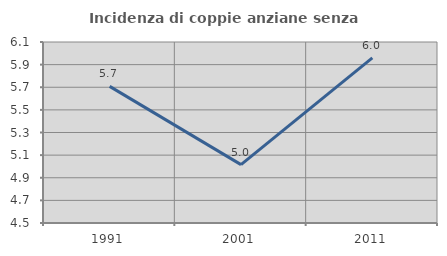
| Category | Incidenza di coppie anziane senza figli  |
|---|---|
| 1991.0 | 5.708 |
| 2001.0 | 5.016 |
| 2011.0 | 5.96 |